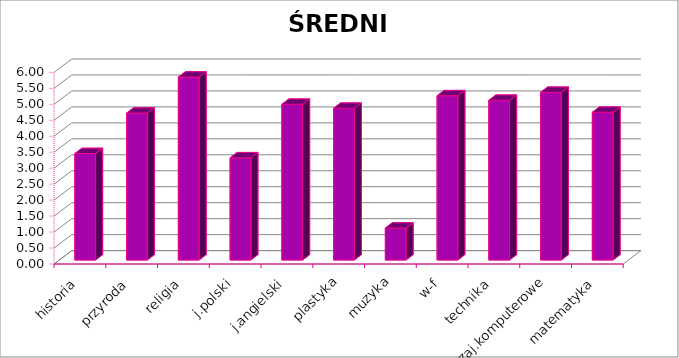
| Category | ŚREDNIA |
|---|---|
| historia | 3.333 |
| przyroda | 4.6 |
| religia | 5.727 |
| j.polski | 3.2 |
| j.angielski | 4.875 |
| plastyka | 4.75 |
| muzyka | 1 |
| w-f | 5.143 |
| technika | 5 |
| zaj.komputerowe | 5.25 |
| matematyka | 4.625 |